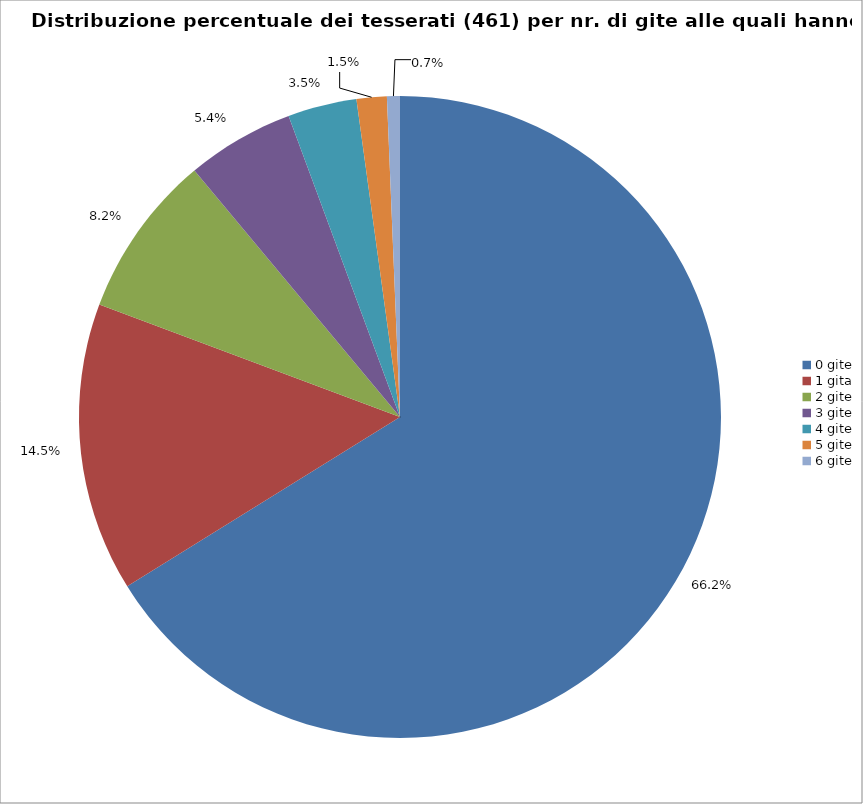
| Category | Nr. Tesserati |
|---|---|
| 0 gite | 305 |
| 1 gita | 67 |
| 2 gite | 38 |
| 3 gite | 25 |
| 4 gite | 16 |
| 5 gite | 7 |
| 6 gite | 3 |